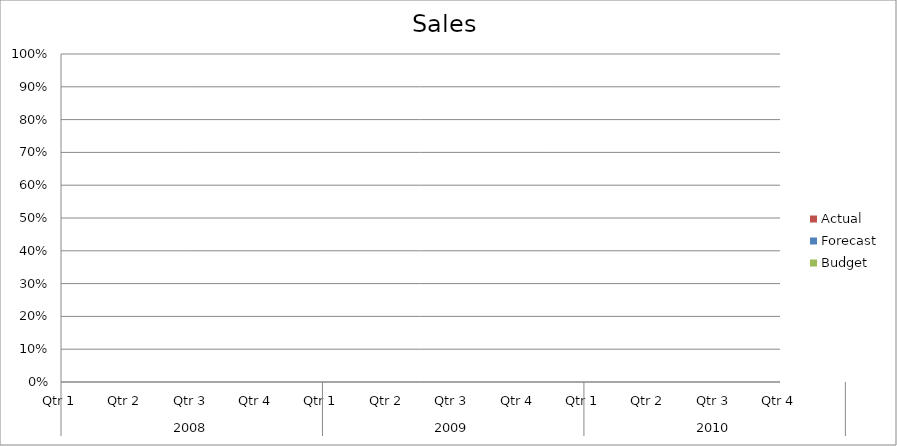
| Category | Budget | Forecast | Actual |
|---|---|---|---|
| 0 | 1180 | 3330 | 1160 |
| 1 | 3350 | 2600 | 3150 |
| 2 | 2170 | 2670 | 3450 |
| 3 | 2880 | 740 | 840 |
| 4 | 2670 | 2470 | 1170 |
| 5 | 530 | 880 | 2270 |
| 6 | 1470 | 1360 | 630 |
| 7 | 1250 | 2430 | 2090 |
| 8 | 1820 | 1970 | 3440 |
| 9 | 2700 | 800 | 3060 |
| 10 | 1780 | 3370 | 1070 |
| 11 | 2840 | 2710 | 520 |